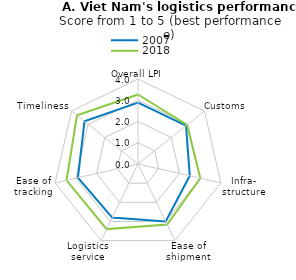
| Category | 2007 | 2018 |
|---|---|---|
| Overall LPI | 2.89 | 3.27 |
| Customs | 2.89 | 2.95 |
| Infra-
structure | 2.5 | 3.01 |
| Ease of shipment | 3 | 3.16 |
| Logistics service | 2.8 | 3.4 |
| Ease of tracking | 2.9 | 3.45 |
| Timeliness | 3.22 | 3.67 |